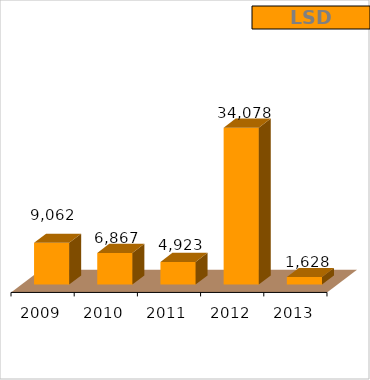
| Category | LSD |
|---|---|
| 2009.0 | 9062 |
| 2010.0 | 6867 |
| 2011.0 | 4923 |
| 2012.0 | 34078 |
| 2013.0 | 1628 |